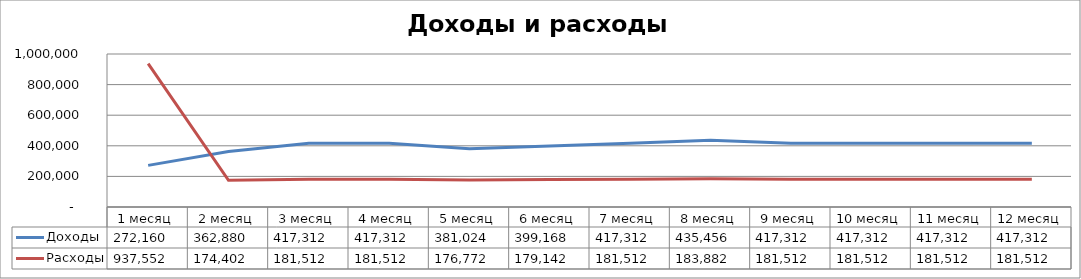
| Category | Доходы | Расходы |
|---|---|---|
| 1 месяц | 272160 | 937551.509 |
| 2 месяц | 362880 | 174402.012 |
| 3 месяц | 417312 | 181512.314 |
| 4 месяц | 417312 | 181512.314 |
| 5 месяц | 381024 | 176772.113 |
| 6 месяц | 399168 | 179142.213 |
| 7 месяц | 417312 | 181512.314 |
| 8 месяц | 435456 | 183882.415 |
| 9 месяц | 417312 | 181512.314 |
| 10 месяц | 417312 | 181512.314 |
| 11 месяц | 417312 | 181512.314 |
| 12 месяц | 417312 | 181512.314 |